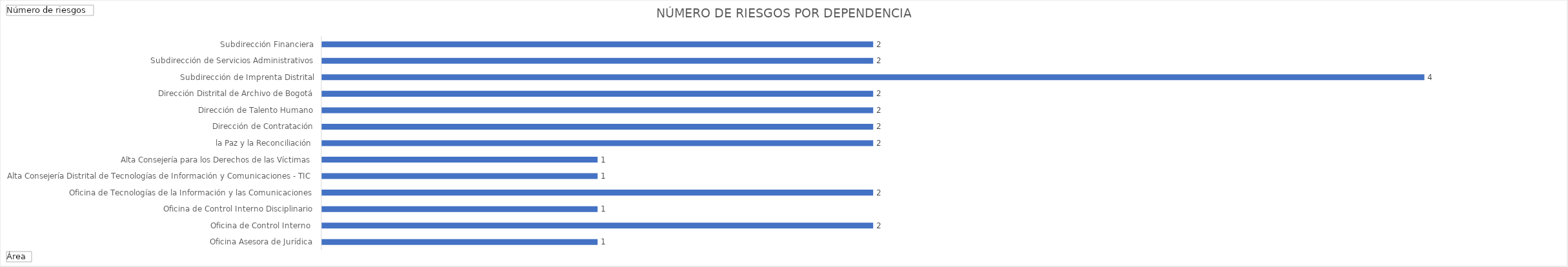
| Category | Total |
|---|---|
|  Oficina Asesora de Jurídica | 1 |
|  Oficina de Control Interno  | 2 |
|  Oficina de Control Interno Disciplinario | 1 |
|  Oficina de Tecnologías de la Información y las Comunicaciones | 2 |
| Alta Consejería Distrital de Tecnologías de Información y Comunicaciones - TIC | 1 |
| Alta Consejería para los Derechos de las Víctimas, la Paz y la Reconciliación | 1 |
| Dirección de Contratación | 2 |
| Dirección de Talento Humano | 2 |
| Dirección Distrital de Archivo de Bogotá | 2 |
| Subdirección de Imprenta Distrital | 2 |
| Subdirección de Servicios Administrativos | 4 |
| Subdirección Financiera | 2 |
| Subsecretaría de Servicio a la Ciudadanía | 2 |